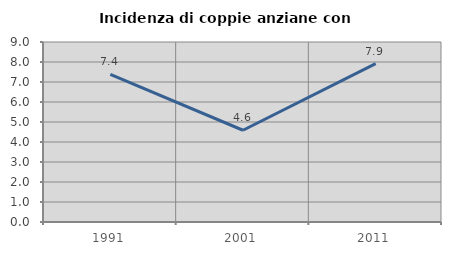
| Category | Incidenza di coppie anziane con figli |
|---|---|
| 1991.0 | 7.377 |
| 2001.0 | 4.587 |
| 2011.0 | 7.921 |